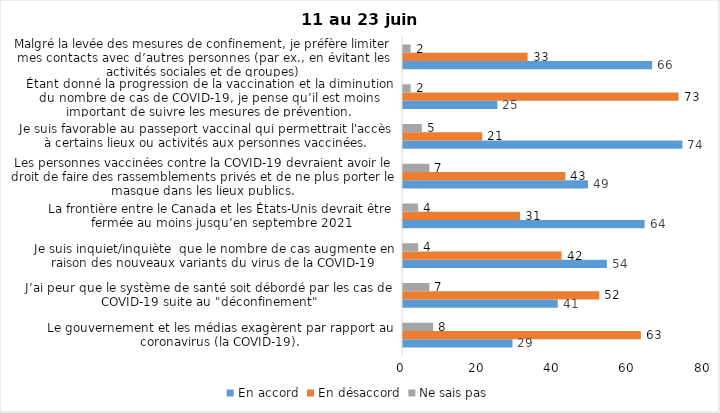
| Category | En accord | En désaccord | Ne sais pas |
|---|---|---|---|
| Le gouvernement et les médias exagèrent par rapport au coronavirus (la COVID-19). | 29 | 63 | 8 |
| J’ai peur que le système de santé soit débordé par les cas de COVID-19 suite au "déconfinement" | 41 | 52 | 7 |
| Je suis inquiet/inquiète  que le nombre de cas augmente en raison des nouveaux variants du virus de la COVID-19 | 54 | 42 | 4 |
| La frontière entre le Canada et les États-Unis devrait être fermée au moins jusqu’en septembre 2021 | 64 | 31 | 4 |
| Les personnes vaccinées contre la COVID-19 devraient avoir le droit de faire des rassemblements privés et de ne plus porter le masque dans les lieux publics. | 49 | 43 | 7 |
| Je suis favorable au passeport vaccinal qui permettrait l'accès à certains lieux ou activités aux personnes vaccinées. | 74 | 21 | 5 |
| Étant donné la progression de la vaccination et la diminution du nombre de cas de COVID-19, je pense qu’il est moins important de suivre les mesures de prévention. | 25 | 73 | 2 |
| Malgré la levée des mesures de confinement, je préfère limiter mes contacts avec d’autres personnes (par ex., en évitant les activités sociales et de groupes) | 66 | 33 | 2 |